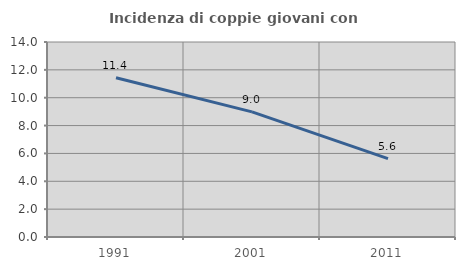
| Category | Incidenza di coppie giovani con figli |
|---|---|
| 1991.0 | 11.433 |
| 2001.0 | 8.984 |
| 2011.0 | 5.626 |